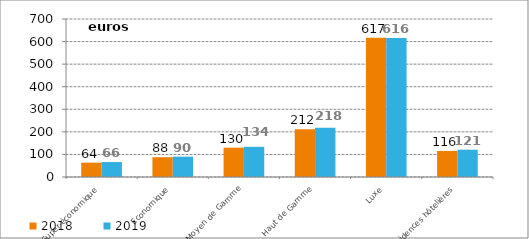
| Category | 2018 | 2019 |
|---|---|---|
| Super-économique | 63.661 | 66.243 |
| Economique | 87.7 | 90.111 |
| Moyen de Gamme | 129.971 | 133.662 |
| Haut de Gamme | 211.733 | 218.13 |
| Luxe | 616.678 | 616.101 |
| Résidences hôtelières | 115.508 | 120.948 |